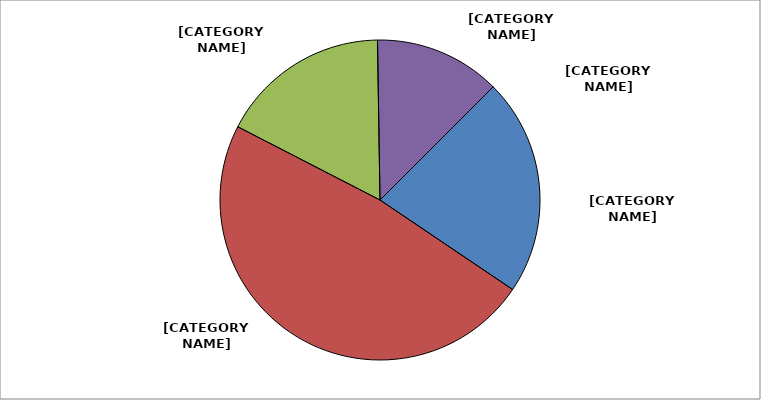
| Category | Series 0 |
|---|---|
| Local Government Contributions | 0.236 |
| Licenses, Permits & Fees | 0.517 |
| State Funded Expenditures | 0.184 |
| Federal Funded Expenditures | 0.137 |
| Other Funded Expenditures | 0 |